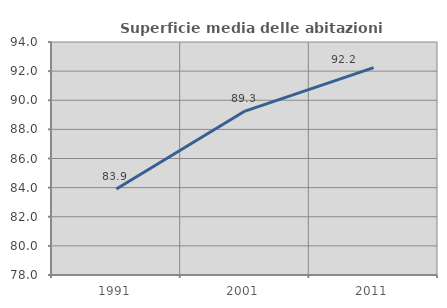
| Category | Superficie media delle abitazioni occupate |
|---|---|
| 1991.0 | 83.906 |
| 2001.0 | 89.257 |
| 2011.0 | 92.239 |